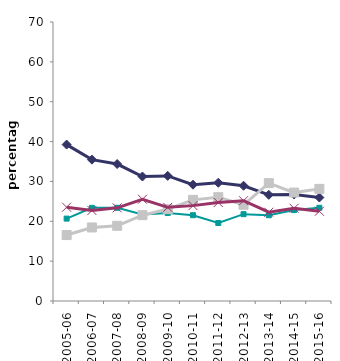
| Category | outright owners | buying with mortgage | private renters | social renters |
|---|---|---|---|---|
| 2005-06 | 20.673 | 39.243 | 16.547 | 23.537 |
| 2006-07 | 23.369 | 35.469 | 18.45 | 22.712 |
| 2007-08 | 23.392 | 34.363 | 18.869 | 23.376 |
| 2008-09 | 21.713 | 31.229 | 21.527 | 25.531 |
| 2009-10 | 22.069 | 31.386 | 23.047 | 23.498 |
| 2010-11 | 21.525 | 29.175 | 25.371 | 23.93 |
| 2011-12 | 19.567 | 29.668 | 26.05 | 24.715 |
| 2012-13 | 21.785 | 28.913 | 24.144 | 25.158 |
| 2013-14 | 21.515 | 26.639 | 29.575 | 22.27 |
| 2014-15 | 22.81 | 26.726 | 27.199 | 23.264 |
| 2015-16 | 23.39 | 25.959 | 28.131 | 22.521 |